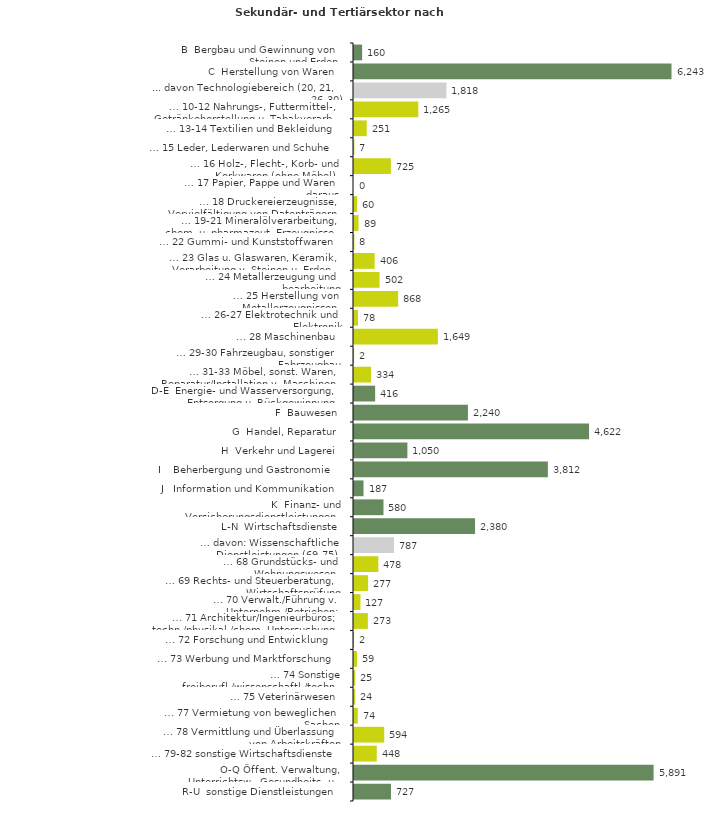
| Category | Series 0 |
|---|---|
| B  Bergbau und Gewinnung von Steinen und Erden | 160 |
| C  Herstellung von Waren | 6243 |
| ... davon Technologiebereich (20, 21, 26-30) | 1818 |
| … 10-12 Nahrungs-, Futtermittel-, Getränkeherstellung u. Tabakverarb. | 1265 |
| … 13-14 Textilien und Bekleidung | 251 |
| … 15 Leder, Lederwaren und Schuhe | 7 |
| … 16 Holz-, Flecht-, Korb- und Korkwaren (ohne Möbel)  | 725 |
| … 17 Papier, Pappe und Waren daraus  | 0 |
| … 18 Druckereierzeugnisse, Vervielfältigung von Datenträgern | 60 |
| … 19-21 Mineralölverarbeitung, chem. u. pharmazeut. Erzeugnisse | 89 |
| … 22 Gummi- und Kunststoffwaren | 8 |
| … 23 Glas u. Glaswaren, Keramik, Verarbeitung v. Steinen u. Erden  | 406 |
| … 24 Metallerzeugung und -bearbeitung | 502 |
| … 25 Herstellung von Metallerzeugnissen  | 868 |
| … 26-27 Elektrotechnik und Elektronik | 78 |
| … 28 Maschinenbau | 1649 |
| … 29-30 Fahrzeugbau, sonstiger Fahrzeugbau | 2 |
| … 31-33 Möbel, sonst. Waren, Reparatur/Installation v. Maschinen | 334 |
| D-E  Energie- und Wasserversorgung, Entsorgung u. Rückgewinnung | 416 |
| F  Bauwesen | 2240 |
| G  Handel, Reparatur | 4622 |
| H  Verkehr und Lagerei | 1050 |
| I    Beherbergung und Gastronomie | 3812 |
| J   Information und Kommunikation | 187 |
| K  Finanz- und Versicherungsdienstleistungen | 580 |
| L-N  Wirtschaftsdienste | 2380 |
| … davon: Wissenschaftliche Dienstleistungen (69-75) | 787 |
| … 68 Grundstücks- und Wohnungswesen  | 478 |
| … 69 Rechts- und Steuerberatung, Wirtschaftsprüfung | 277 |
| … 70 Verwalt./Führung v. Unternehm./Betrieben; Unternehmensberat. | 127 |
| … 71 Architektur/Ingenieurbüros; techn./physikal./chem. Untersuchung | 273 |
| … 72 Forschung und Entwicklung  | 2 |
| … 73 Werbung und Marktforschung | 59 |
| … 74 Sonstige freiberufl./wissenschaftl./techn. Tätigkeiten | 25 |
| … 75 Veterinärwesen | 24 |
| … 77 Vermietung von beweglichen Sachen  | 74 |
| … 78 Vermittlung und Überlassung von Arbeitskräften | 594 |
| … 79-82 sonstige Wirtschaftsdienste | 448 |
| O-Q Öffent. Verwaltung, Unterrichtsw., Gesundheits- u. Sozialwesen | 5891 |
| R-U  sonstige Dienstleistungen | 727 |